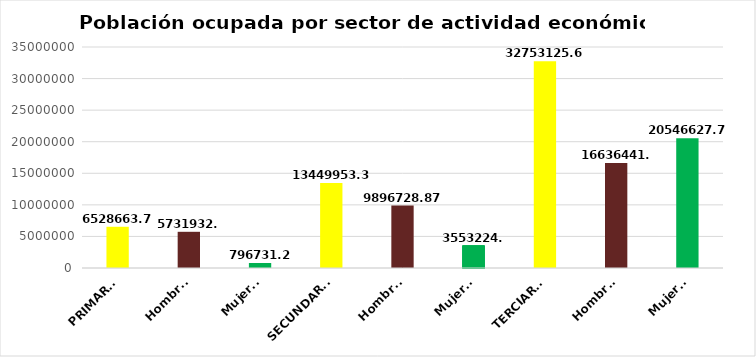
| Category | 2020 |
|---|---|
| PRIMARIO | 6528663.75 |
| Hombres | 5731932.5 |
| Mujeres | 796731.25 |
| SECUNDARIO | 13449953.375 |
| Hombres | 9896728.875 |
| Mujeres | 3553224.5 |
| TERCIARIO | 32753125.625 |
| Hombres | 16636441.5 |
| Mujeres | 20546627.75 |